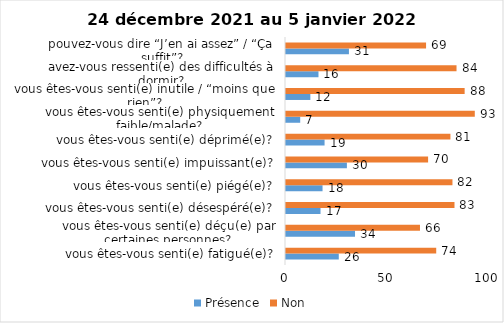
| Category | Présence | Non |
|---|---|---|
| vous êtes-vous senti(e) fatigué(e)? | 26 | 74 |
| vous êtes-vous senti(e) déçu(e) par certaines personnes? | 34 | 66 |
| vous êtes-vous senti(e) désespéré(e)? | 17 | 83 |
| vous êtes-vous senti(e) piégé(e)? | 18 | 82 |
| vous êtes-vous senti(e) impuissant(e)? | 30 | 70 |
| vous êtes-vous senti(e) déprimé(e)? | 19 | 81 |
| vous êtes-vous senti(e) physiquement faible/malade? | 7 | 93 |
| vous êtes-vous senti(e) inutile / “moins que rien”? | 12 | 88 |
| avez-vous ressenti(e) des difficultés à dormir? | 16 | 84 |
| pouvez-vous dire “J’en ai assez” / “Ça suffit”? | 31 | 69 |